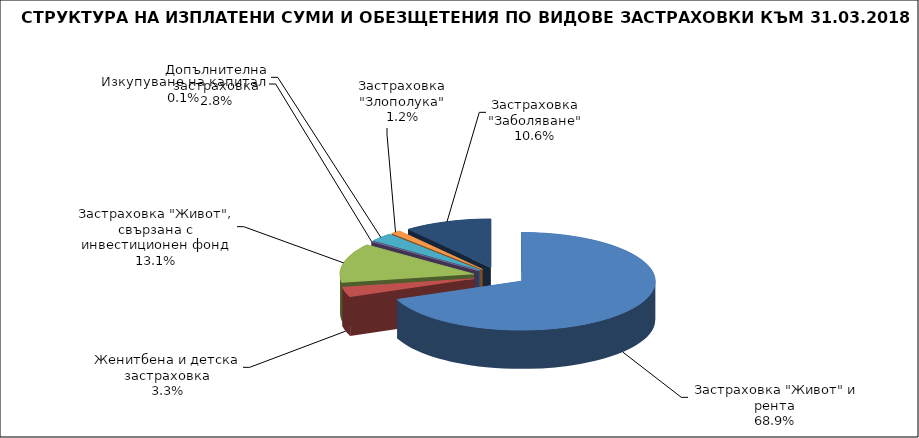
| Category | Series 0 |
|---|---|
|  Застраховка "Живот" и рента | 28563684.969 |
| Женитбена и детска застраховка | 1367744.29 |
| Застраховка "Живот", свързана с инвестиционен фонд | 5426635.419 |
| Изкупуване на капитал | 24490.833 |
| Допълнителна застраховка | 1178502.65 |
| Застраховка "Злополука" | 508657.41 |
| Застраховка "Заболяване" | 4406195.583 |